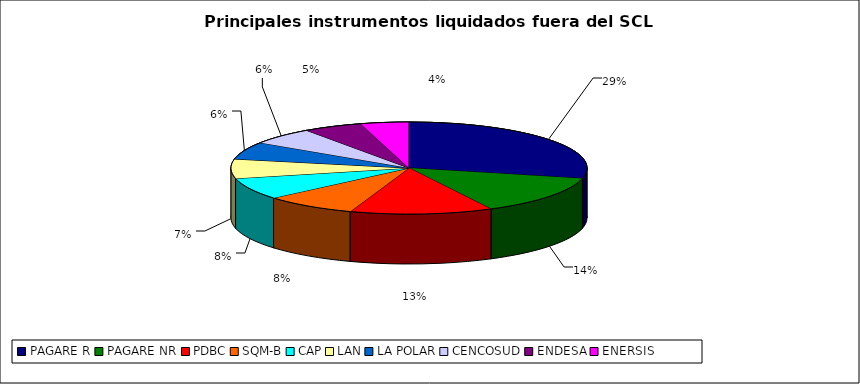
| Category | Series 0 |
|---|---|
| PAGARE R | 2306 |
| PAGARE NR | 1105 |
| PDBC | 1043 |
| SQM-B | 677 |
| CAP | 612 |
| LAN | 545 |
| LA POLAR | 494 |
| CENCOSUD | 480 |
| ENDESA | 432 |
| ENERSIS | 353 |